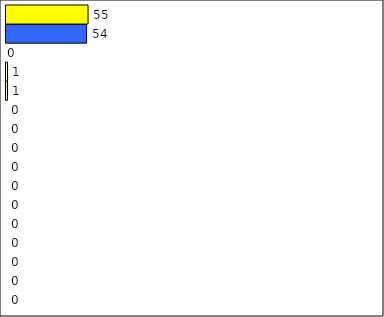
| Category | -2 | -1 | 0 | 1 | 2 | 3 | 4 | 5 | 6 | 7 | 8 | 9 | 10 | 11 | 12 | Perfect Round |
|---|---|---|---|---|---|---|---|---|---|---|---|---|---|---|---|---|
| 0 | 0 | 0 | 0 | 0 | 0 | 0 | 0 | 0 | 0 | 0 | 0 | 1 | 1 | 0 | 54 | 55 |